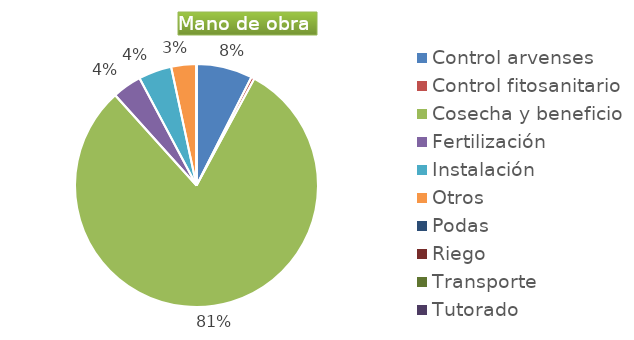
| Category | Series 0 |
|---|---|
| Control arvenses | 3382063 |
| Control fitosanitario | 196280 |
| Cosecha y beneficio | 36469825 |
| Fertilización | 1766520 |
| Instalación | 2002056 |
| Otros | 1521170 |
| Podas | 0 |
| Riego | 0 |
| Transporte | 0 |
| Tutorado | 0 |